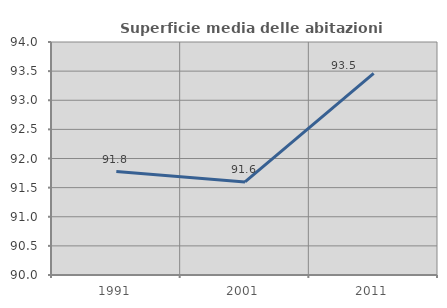
| Category | Superficie media delle abitazioni occupate |
|---|---|
| 1991.0 | 91.776 |
| 2001.0 | 91.598 |
| 2011.0 | 93.463 |